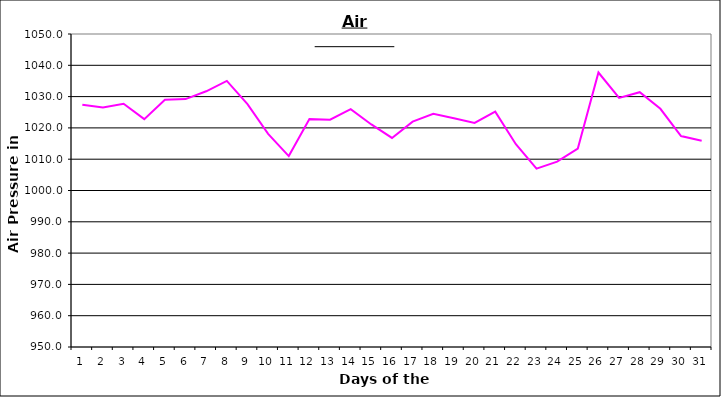
| Category | Series 0 |
|---|---|
| 0 | 1027.4 |
| 1 | 1026.5 |
| 2 | 1027.7 |
| 3 | 1022.8 |
| 4 | 1029 |
| 5 | 1029.2 |
| 6 | 1031.7 |
| 7 | 1035 |
| 8 | 1027.6 |
| 9 | 1018.1 |
| 10 | 1011 |
| 11 | 1022.8 |
| 12 | 1022.6 |
| 13 | 1026 |
| 14 | 1021.1 |
| 15 | 1016.8 |
| 16 | 1022 |
| 17 | 1024.5 |
| 18 | 1023.1 |
| 19 | 1021.6 |
| 20 | 1025.2 |
| 21 | 1014.8 |
| 22 | 1007 |
| 23 | 1009.2 |
| 24 | 1013.4 |
| 25 | 1037.7 |
| 26 | 1029.6 |
| 27 | 1031.4 |
| 28 | 1026.1 |
| 29 | 1017.4 |
| 30 | 1015.9 |